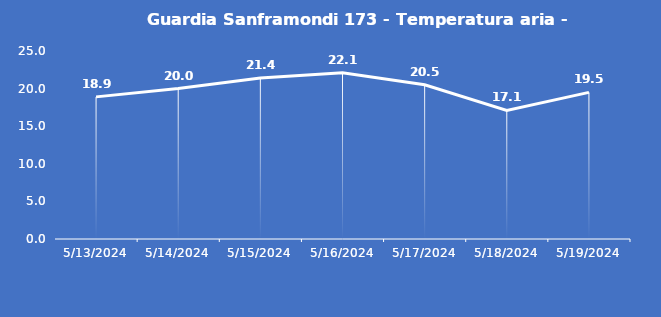
| Category | Guardia Sanframondi 173 - Temperatura aria - Grezzo (°C) |
|---|---|
| 5/13/24 | 18.9 |
| 5/14/24 | 20 |
| 5/15/24 | 21.4 |
| 5/16/24 | 22.1 |
| 5/17/24 | 20.5 |
| 5/18/24 | 17.1 |
| 5/19/24 | 19.5 |